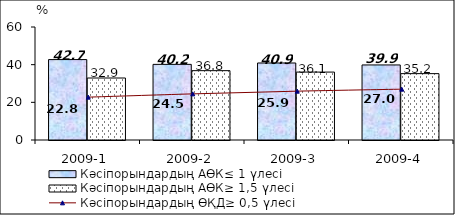
| Category | Кәсіпорындардың АӨК≤ 1 үлесі | Кәсіпорындардың АӨК≥ 1,5 үлесі |
|---|---|---|
| 2009-1 | 42.697 | 32.914 |
| 2009-2 | 40.159 | 36.816 |
| 2009-3 | 40.892 | 36.064 |
| 2009-4 | 39.855 | 35.243 |